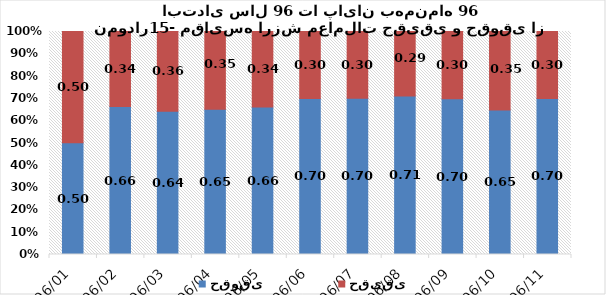
| Category | حقوقی | حقیقی |
|---|---|---|
| 1396/01 | 0.502 | 0.498 |
| 1396/02 | 0.663 | 0.337 |
| 1396/03 | 0.642 | 0.358 |
| 1396/04 | 0.651 | 0.349 |
| 1396/05 | 0.662 | 0.338 |
| 1396/06 | 0.7 | 0.3 |
| 1396/07 | 0.701 | 0.299 |
| 1396/08 | 0.711 | 0.289 |
| 1396/09 | 0.699 | 0.301 |
| 1396/10 | 0.648 | 0.352 |
| 1396/11 | 0.7 | 0.3 |